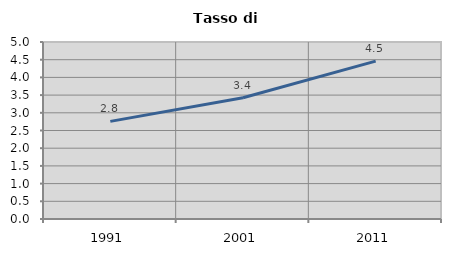
| Category | Tasso di disoccupazione   |
|---|---|
| 1991.0 | 2.757 |
| 2001.0 | 3.424 |
| 2011.0 | 4.46 |